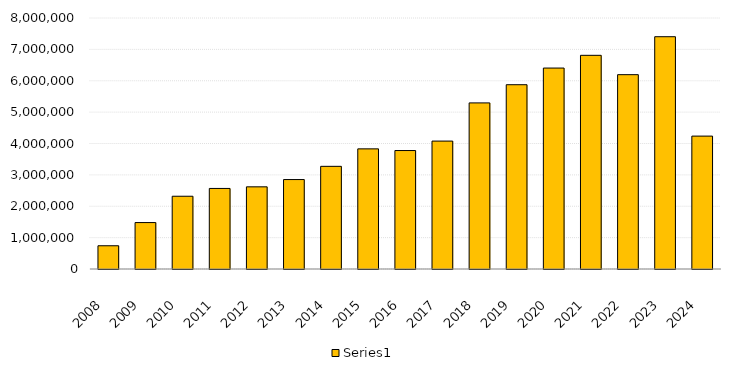
| Category | Series 0 |
|---|---|
| 2008.0 | 740750 |
| 2009.0 | 1479892 |
| 2010.0 | 2318874 |
| 2011.0 | 2567704 |
| 2012.0 | 2618620 |
| 2013.0 | 2851046 |
| 2014.0 | 3272260 |
| 2015.0 | 3829025.329 |
| 2016.0 | 3775869.712 |
| 2017.0 | 4076755.288 |
| 2018.0 | 5293930.505 |
| 2019.0 | 5873557.825 |
| 2020.0 | 6404629.537 |
| 2021.0 | 6810363.932 |
| 2022.0 | 6193857.311 |
| 2023.0 | 7403437.151 |
| 2024.0 | 4235627.467 |